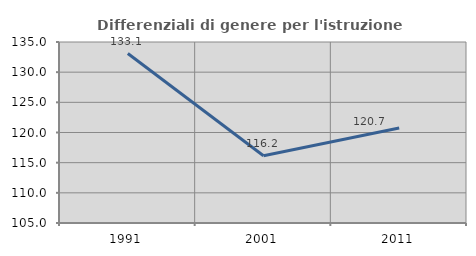
| Category | Differenziali di genere per l'istruzione superiore |
|---|---|
| 1991.0 | 133.092 |
| 2001.0 | 116.157 |
| 2011.0 | 120.737 |